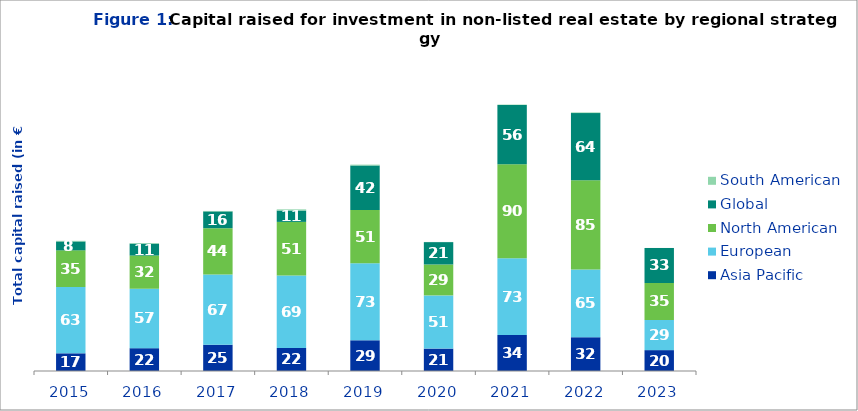
| Category | Asia Pacific | European | North American | Global | South American |
|---|---|---|---|---|---|
| 0 | 16.829 | 63.093 | 35 | 8.462 | 0.587 |
| 1 | 21.726 | 56.6 | 31.628 | 11.322 | 0.56 |
| 2 | 25 | 67 | 44 | 16 | 0.427 |
| 3 | 22 | 69 | 51 | 10.835 | 1.109 |
| 4 | 29.251 | 73.342 | 50.736 | 42.423 | 0.788 |
| 5 | 21.338 | 50.646 | 29.467 | 21.313 | 0.139 |
| 6 | 34.322 | 72.976 | 89.724 | 56.327 | 0.417 |
| 7 | 32.042 | 64.718 | 84.996 | 63.871 | 0.64 |
| 8 | 19.883 | 28.75 | 35.282 | 33.237 | 0.051 |